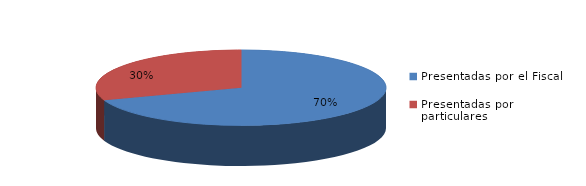
| Category | Series 0 |
|---|---|
| Presentadas por el Fiscal | 233 |
| Presentadas por particulares | 102 |